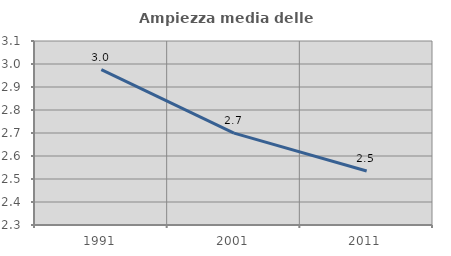
| Category | Ampiezza media delle famiglie |
|---|---|
| 1991.0 | 2.975 |
| 2001.0 | 2.699 |
| 2011.0 | 2.535 |